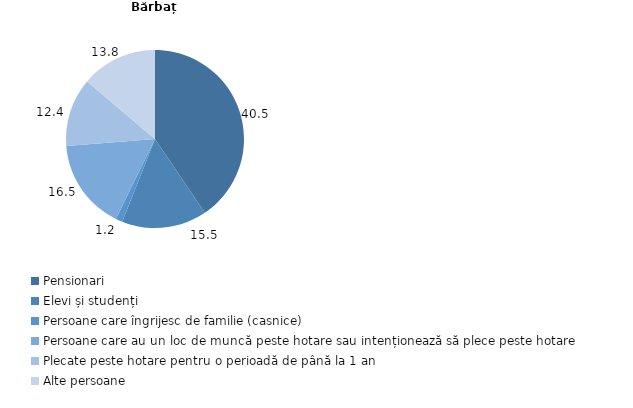
| Category | Bărbați |
|---|---|
| Pensionari | 40.539 |
| Elevi și studenți | 15.466 |
| Persoane care îngrijesc de familie (casnice) | 1.24 |
| Persoane care au un loc de muncă peste hotare sau intenționează să plece peste hotare | 16.517 |
| Plecate peste hotare pentru o perioadă de până la 1 an | 12.415 |
| Alte persoane | 13.823 |